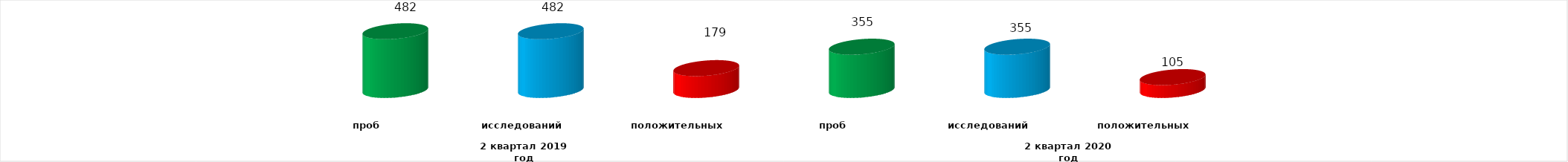
| Category | Series 4 |
|---|---|
| 0 | 482 |
| 1 | 482 |
| 2 | 179 |
| 3 | 355 |
| 4 | 355 |
| 5 | 105 |